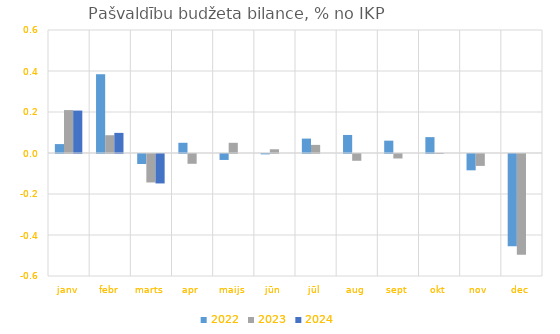
| Category | 2022 | 2023 | 2024 |
|---|---|---|---|
| janv | 0.044 | 0.209 | 0.207 |
| febr | 0.384 | 0.087 | 0.098 |
| marts | -0.049 | -0.139 | -0.144 |
| apr | 0.05 | -0.048 | 0 |
| maijs | -0.029 | 0.05 | 0 |
| jūn | -0.002 | 0.018 | 0 |
| jūl | 0.07 | 0.04 | 0 |
| aug | 0.088 | -0.033 | 0 |
| sept | 0.06 | -0.022 | 0 |
| okt | 0.077 | 0 | 0 |
| nov | -0.08 | -0.058 | 0 |
| dec | -0.451 | -0.491 | 0 |